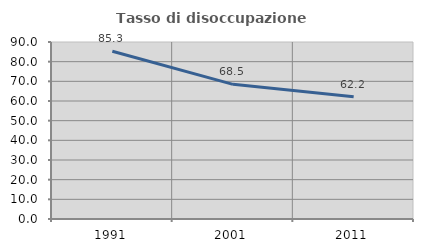
| Category | Tasso di disoccupazione giovanile  |
|---|---|
| 1991.0 | 85.26 |
| 2001.0 | 68.47 |
| 2011.0 | 62.168 |